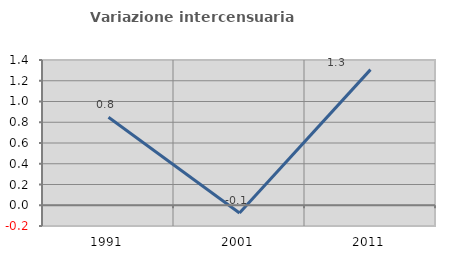
| Category | Variazione intercensuaria annua |
|---|---|
| 1991.0 | 0.847 |
| 2001.0 | -0.075 |
| 2011.0 | 1.307 |